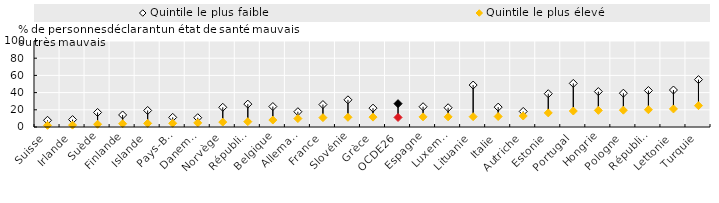
| Category | Quintile le plus faible | Quintile le plus élevé |
|---|---|---|
| Suisse | 7.8 | 1.9 |
| Irlande | 8.6 | 2.2 |
| Suède | 16.9 | 3.2 |
| Finlande | 14 | 3.8 |
| Islande | 19.2 | 4.2 |
| Pays-Bas | 11.2 | 4.3 |
| Danemark | 10.8 | 4.8 |
| Norvège | 22.9 | 5.7 |
| République tchèque | 26.6 | 6.2 |
| Belgique | 23.8 | 8.1 |
| Allemagne | 17.8 | 9.8 |
| France | 26.1 | 10.9 |
| Slovénie | 31.6 | 11.3 |
| Grèce | 21.9 | 11.5 |
| OCDE26 | 27.138 | 11.088 |
| Espagne | 23.6 | 11.8 |
| Luxembourg | 22.4 | 11.8 |
| Lituanie | 48.8 | 12 |
| Italie | 23.1 | 12.2 |
| Autriche | 18.1 | 12.8 |
| Estonie | 38.7 | 16.4 |
| Portugal | 50.7 | 18.6 |
| Hongrie | 41.2 | 19.3 |
| Pologne | 39.3 | 19.6 |
| République slovaque | 42.4 | 20.1 |
| Lettonie | 43 | 21 |
| Turquie | 55.1 | 24.8 |